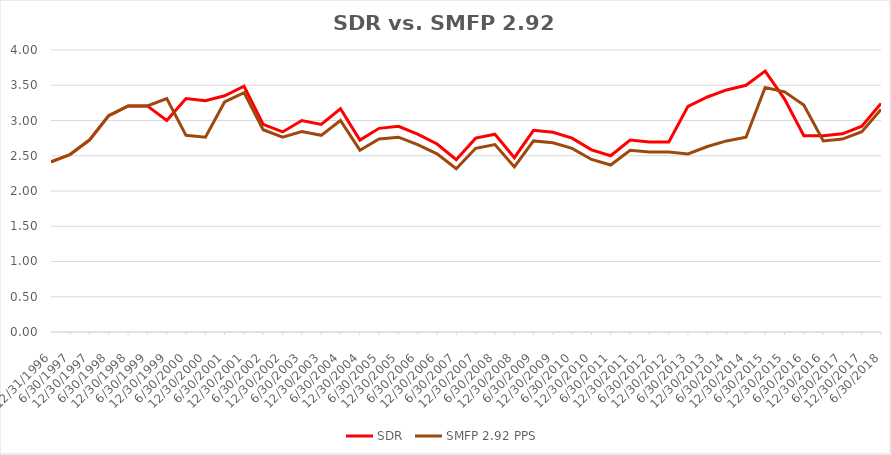
| Category | SDR | SMFP 2.92 PPS |
|---|---|---|
| 12/31/96 | 2.414 | 2.414 |
| 6/30/97 | 2.517 | 2.517 |
| 12/31/97 | 2.724 | 2.724 |
| 6/30/98 | 3.069 | 3.069 |
| 12/31/98 | 3.207 | 3.207 |
| 6/30/99 | 3.207 | 3.207 |
| 12/31/99 | 3 | 3.31 |
| 6/30/00 | 3.312 | 2.789 |
| 12/31/00 | 3.281 | 2.763 |
| 6/30/01 | 3.351 | 3.263 |
| 12/31/01 | 3.486 | 3.395 |
| 6/30/02 | 2.946 | 2.868 |
| 12/31/02 | 2.838 | 2.763 |
| 6/30/03 | 3 | 2.842 |
| 12/31/03 | 2.944 | 2.789 |
| 6/30/04 | 3.167 | 3 |
| 12/31/04 | 2.722 | 2.579 |
| 6/30/05 | 2.889 | 2.737 |
| 12/31/05 | 2.917 | 2.763 |
| 6/30/06 | 2.806 | 2.658 |
| 12/31/06 | 2.667 | 2.526 |
| 6/30/07 | 2.444 | 2.316 |
| 12/31/07 | 2.75 | 2.605 |
| 6/30/08 | 2.806 | 2.658 |
| 12/31/08 | 2.472 | 2.342 |
| 6/30/09 | 2.861 | 2.711 |
| 12/31/09 | 2.833 | 2.684 |
| 6/30/10 | 2.75 | 2.605 |
| 12/31/10 | 2.583 | 2.447 |
| 6/30/11 | 2.5 | 2.368 |
| 12/31/11 | 2.722 | 2.579 |
| 6/30/12 | 2.694 | 2.553 |
| 12/31/12 | 2.694 | 2.553 |
| 6/30/13 | 3.2 | 2.526 |
| 12/31/13 | 3.333 | 2.632 |
| 6/30/14 | 3.433 | 2.711 |
| 12/31/14 | 3.5 | 2.763 |
| 6/30/15 | 3.7 | 3.469 |
| 12/31/15 | 3.303 | 3.406 |
| 6/30/16 | 2.784 | 3.219 |
| 12/31/16 | 2.784 | 2.711 |
| 6/30/17 | 2.811 | 2.737 |
| 12/31/17 | 2.919 | 2.842 |
| 6/30/18 | 3.243 | 3.158 |